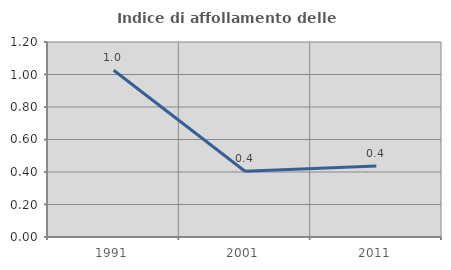
| Category | Indice di affollamento delle abitazioni  |
|---|---|
| 1991.0 | 1.026 |
| 2001.0 | 0.405 |
| 2011.0 | 0.436 |